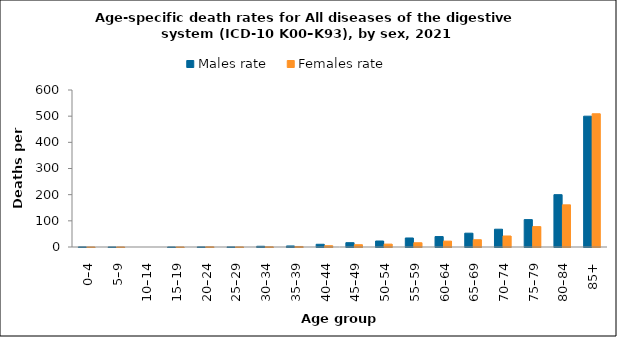
| Category | Males rate | Females rate |
|---|---|---|
| 0–4 | 0.386 | 0.136 |
| 5–9 | 0.12 | 0.127 |
| 10–14 | 0 | 0 |
| 15–19 | 0.131 | 0.139 |
| 20–24 | 0.358 | 0.763 |
| 25–29 | 0.327 | 0.332 |
| 30–34 | 2.764 | 0.834 |
| 35–39 | 3.986 | 2.023 |
| 40–44 | 10.418 | 4.889 |
| 45–49 | 16.518 | 8.766 |
| 50–54 | 22.917 | 11.011 |
| 55–59 | 34.49 | 16.244 |
| 60–64 | 39.933 | 22.419 |
| 65–69 | 52.79 | 27.769 |
| 70–74 | 67.966 | 42.055 |
| 75–79 | 104.682 | 77.977 |
| 80–84 | 200.03 | 161.112 |
| 85+ | 499.959 | 509.152 |